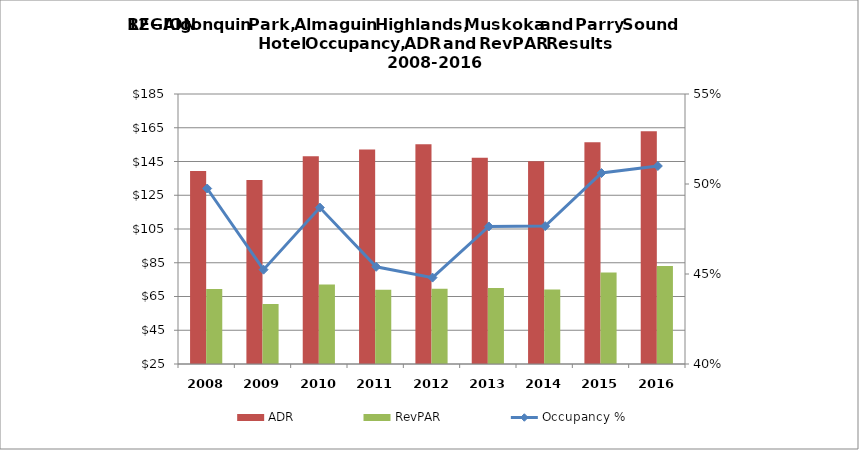
| Category | ADR | RevPAR |
|---|---|---|
| 2008.0 | 139.44 | 69.371 |
| 2009.0 | 134.01 | 60.626 |
| 2010.0 | 148.18 | 72.149 |
| 2011.0 | 152.05 | 69.031 |
| 2012.0 | 155.18 | 69.521 |
| 2013.0 | 147.15 | 70.102 |
| 2014.0 | 145.11 | 69.159 |
| 2015.0 | 156.39 | 79.15 |
| 2016.0 | 162.98 | 83.14 |